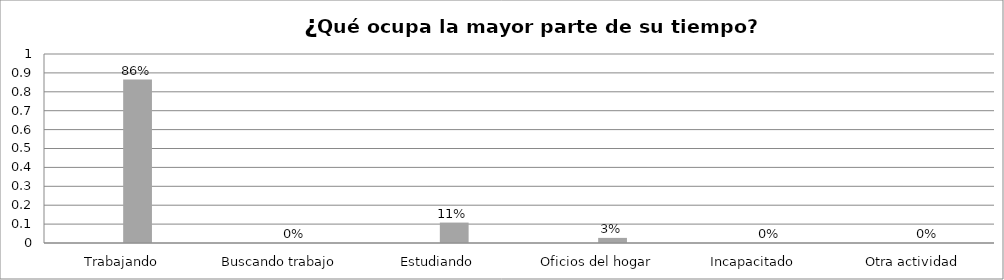
| Category | Series 0 | Series 1 | Series 2 | Series 3 |
|---|---|---|---|---|
| Trabajando |  |  | 0.865 |  |
| Buscando trabajo |  |  | 0 |  |
| Estudiando |  |  | 0.108 |  |
| Oficios del hogar |  |  | 0.027 |  |
| Incapacitado  |  |  | 0 |  |
| Otra actividad |  |  | 0 |  |